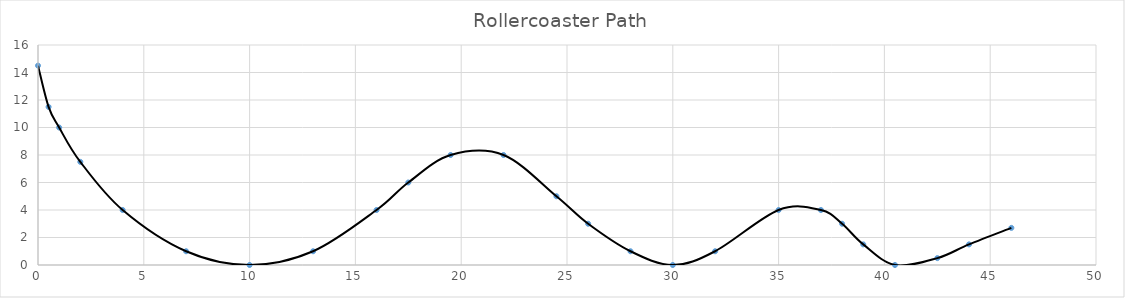
| Category | y    [in] |
|---|---|
| 0.0 | 14.5 |
| 0.5 | 11.5 |
| 1.0 | 10 |
| 2.0 | 7.5 |
| 4.0 | 4 |
| 7.0 | 1 |
| 10.0 | 0 |
| 13.0 | 1 |
| 16.0 | 4 |
| 17.5 | 6 |
| 19.5 | 8 |
| 22.0 | 8 |
| 24.5 | 5 |
| 26.0 | 3 |
| 28.0 | 1 |
| 30.0 | 0 |
| 32.0 | 1 |
| 35.0 | 4 |
| 37.0 | 4 |
| 38.0 | 3 |
| 39.0 | 1.5 |
| 40.5 | 0 |
| 42.5 | 0.5 |
| 44.0 | 1.5 |
| 46.0 | 2.7 |